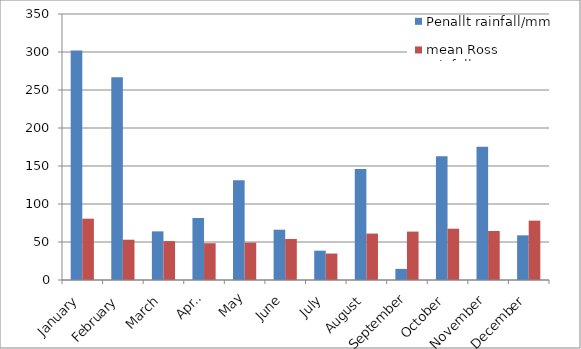
| Category | Penallt rainfall/mm | mean Ross rainfall/mm |
|---|---|---|
| January | 302.1 | 80.7 |
| February | 266.9 | 53 |
| March | 64 | 51.2 |
| April | 81.6 | 48.4 |
| May | 131.1 | 49.2 |
| June | 66.2 | 54 |
| July | 38.6 | 34.8 |
| August | 146 | 61.1 |
| September | 14.6 | 63.7 |
| October | 162.8 | 67.5 |
| November | 175.4 | 64.5 |
| December | 58.8 | 78.1 |